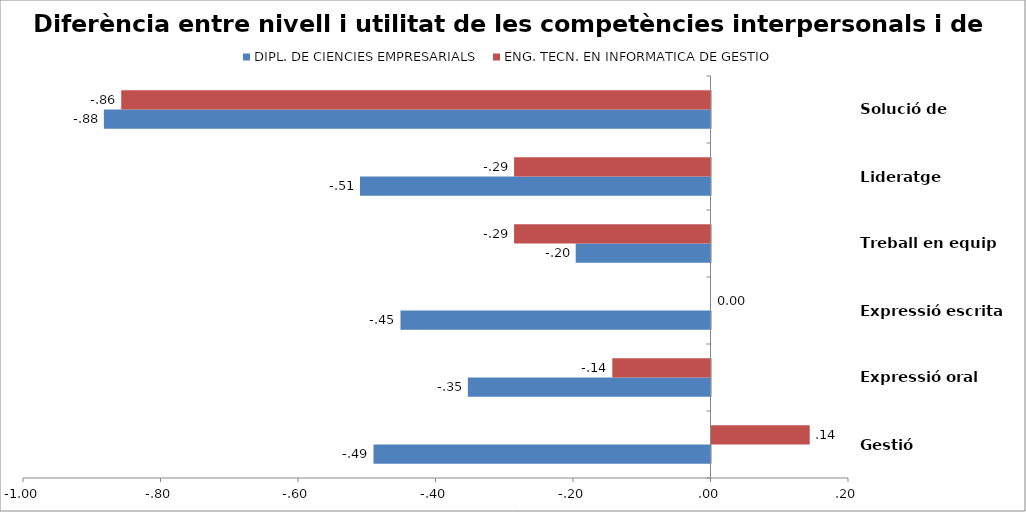
| Category | DIPL. DE CIENCIES EMPRESARIALS | ENG. TECN. EN INFORMATICA DE GESTIO |
|---|---|---|
| Gestió | -0.49 | 0.143 |
| Expressió oral | -0.353 | -0.143 |
| Expressió escrita | -0.451 | 0 |
| Treball en equip | -0.196 | -0.286 |
| Lideratge | -0.51 | -0.286 |
| Solució de prombles | -0.882 | -0.857 |